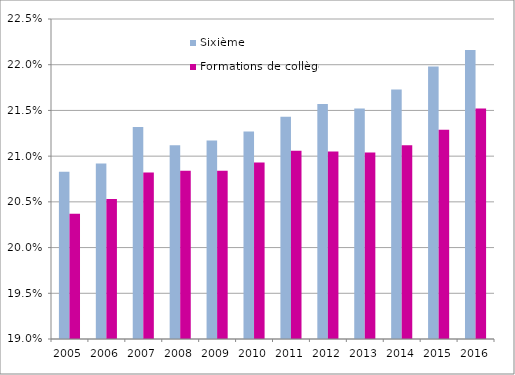
| Category | Sixième | Formations de collège |
|---|---|---|
| 2005.0 | 0.208 | 0.204 |
| 2006.0 | 0.209 | 0.205 |
| 2007.0 | 0.213 | 0.208 |
| 2008.0 | 0.211 | 0.208 |
| 2009.0 | 0.212 | 0.208 |
| 2010.0 | 0.213 | 0.209 |
| 2011.0 | 0.214 | 0.211 |
| 2012.0 | 0.216 | 0.21 |
| 2013.0 | 0.215 | 0.21 |
| 2014.0 | 0.217 | 0.211 |
| 2015.0 | 0.22 | 0.213 |
| 2016.0 | 0.222 | 0.215 |